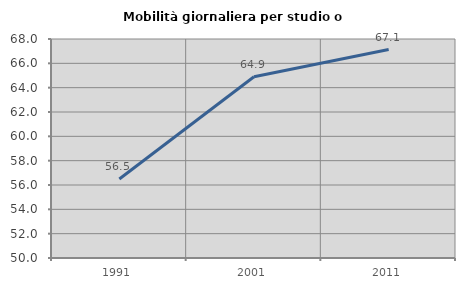
| Category | Mobilità giornaliera per studio o lavoro |
|---|---|
| 1991.0 | 56.493 |
| 2001.0 | 64.894 |
| 2011.0 | 67.135 |